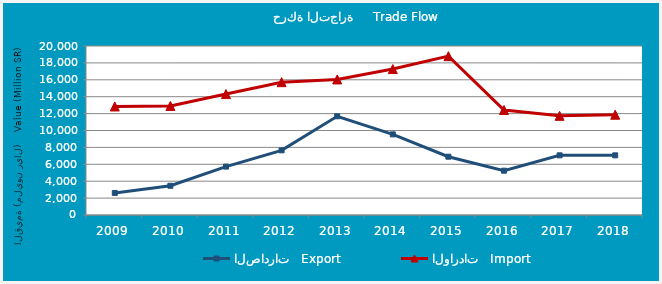
| Category | الصادرات   Export | الواردات   Import |
|---|---|---|
| 2009.0 | 2612038631 | 12842266284 |
| 2010.0 | 3460619119 | 12908930666 |
| 2011.0 | 5729612414 | 14312569820 |
| 2012.0 | 7652019304 | 15719460468 |
| 2013.0 | 11683413706 | 16043105290 |
| 2014.0 | 9543160508 | 17271164935 |
| 2015.0 | 6899316247 | 18799231873 |
| 2016.0 | 5245015060 | 12428714349 |
| 2017.0 | 7061399316 | 11735481038 |
| 2018.0 | 7060039586 | 11868173575 |